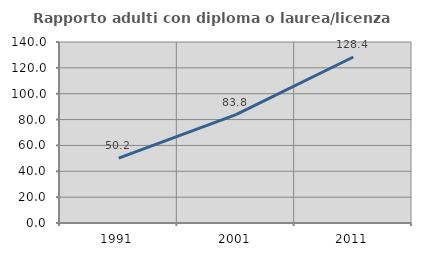
| Category | Rapporto adulti con diploma o laurea/licenza media  |
|---|---|
| 1991.0 | 50.246 |
| 2001.0 | 83.806 |
| 2011.0 | 128.39 |